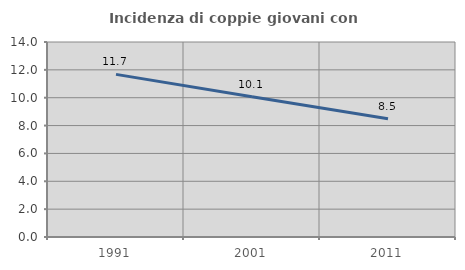
| Category | Incidenza di coppie giovani con figli |
|---|---|
| 1991.0 | 11.675 |
| 2001.0 | 10.065 |
| 2011.0 | 8.493 |